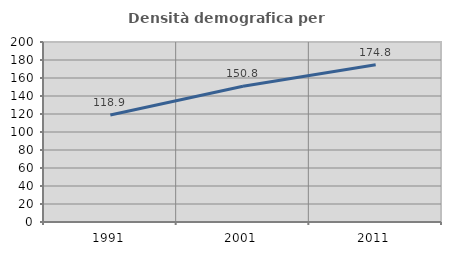
| Category | Densità demografica |
|---|---|
| 1991.0 | 118.939 |
| 2001.0 | 150.822 |
| 2011.0 | 174.804 |